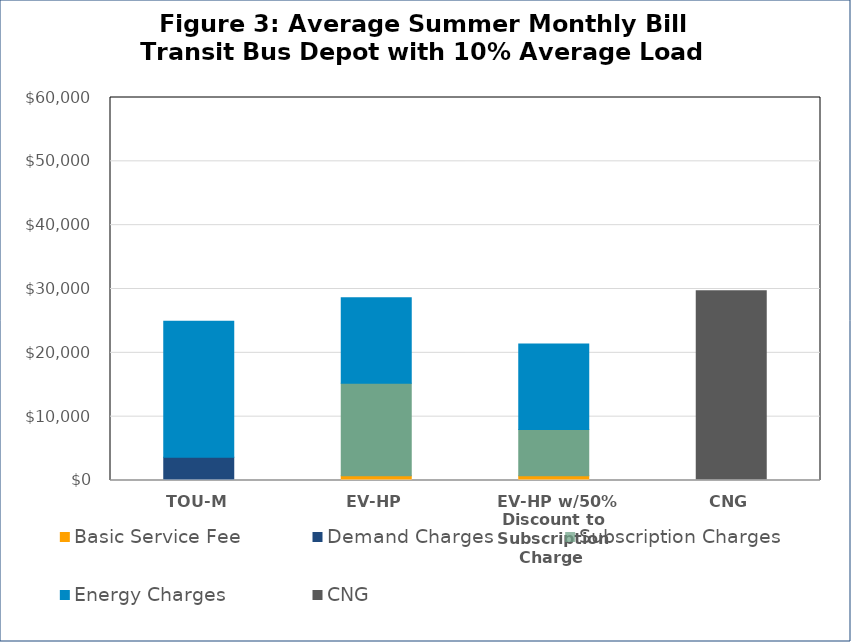
| Category | Basic Service Fee | Demand Charges | Subscription Charges | Energy Charges | CNG |
|---|---|---|---|---|---|
|  TOU-M  | 101.56 | 3552 | 0 | 21295.317 | 0 |
|  EV-HP  | 744.64 | 0 | 14478.63 | 13410.1 | 0 |
|  EV-HP w/50% Discount to Subscription Charge  | 744.64 | 0 | 7239.315 | 13410.1 | 0 |
|  CNG  | 0 | 0 | 0 | 0 | 29735.429 |